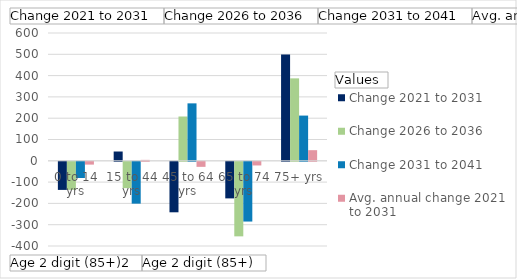
| Category | Change 2021 to 2031 | Change 2026 to 2036 | Change 2031 to 2041 | Avg. annual change 2021 to 2031 |
|---|---|---|---|---|
| 0 to 14 yrs | -131.952 | -131.607 | -76.203 | -13.195 |
| 15 to 44 yrs | 43.612 | -123.559 | -196.481 | 4.361 |
| 45 to 64 yrs | -237.078 | 207.964 | 269.675 | -23.708 |
| 65 to 74 yrs | -171.76 | -350.012 | -280.505 | -17.176 |
| 75+ yrs | 498.917 | 387.046 | 212.313 | 49.892 |